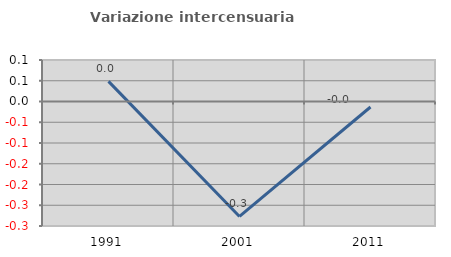
| Category | Variazione intercensuaria annua |
|---|---|
| 1991.0 | 0.048 |
| 2001.0 | -0.277 |
| 2011.0 | -0.013 |